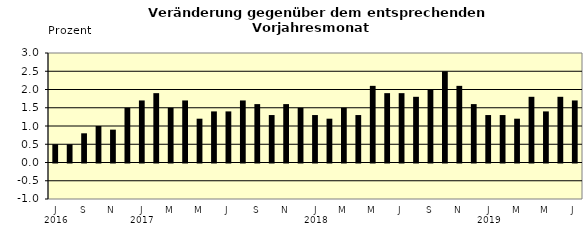
| Category | Series 0 |
|---|---|
| 0 | 0.5 |
| 1 | 0.5 |
| 2 | 0.8 |
| 3 | 1 |
| 4 | 0.9 |
| 5 | 1.5 |
| 6 | 1.7 |
| 7 | 1.9 |
| 8 | 1.5 |
| 9 | 1.7 |
| 10 | 1.2 |
| 11 | 1.4 |
| 12 | 1.4 |
| 13 | 1.7 |
| 14 | 1.6 |
| 15 | 1.3 |
| 16 | 1.6 |
| 17 | 1.5 |
| 18 | 1.3 |
| 19 | 1.2 |
| 20 | 1.5 |
| 21 | 1.3 |
| 22 | 2.1 |
| 23 | 1.9 |
| 24 | 1.9 |
| 25 | 1.8 |
| 26 | 2 |
| 27 | 2.5 |
| 28 | 2.1 |
| 29 | 1.6 |
| 30 | 1.3 |
| 31 | 1.3 |
| 32 | 1.2 |
| 33 | 1.8 |
| 34 | 1.4 |
| 35 | 1.8 |
| 36 | 1.7 |